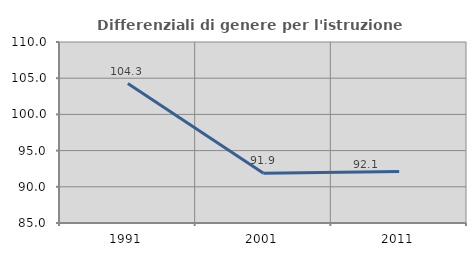
| Category | Differenziali di genere per l'istruzione superiore |
|---|---|
| 1991.0 | 104.253 |
| 2001.0 | 91.884 |
| 2011.0 | 92.127 |